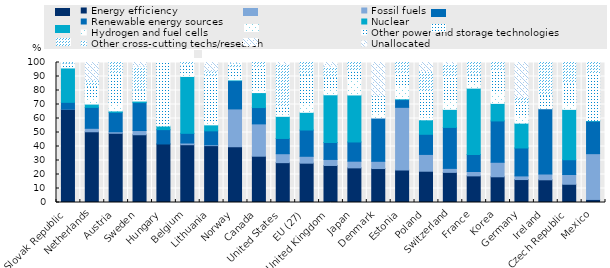
| Category | Energy efficiency | Fossil fuels | Renewable energy sources | Nuclear | Hydrogen and fuel cells | Other power and storage technologies | Other cross-cutting techs/research | Unallocated |
|---|---|---|---|---|---|---|---|---|
| Slovak Republic | 66.634 | 0.053 | 4.86 | 24.558 | 0.866 | 2.685 | 0.345 | 0 |
| Netherlands | 50.517 | 2.482 | 14.944 | 2.358 | 5.012 | 7.684 | 4.27 | 12.732 |
| Austria | 49.47 | 1.064 | 13.862 | 1.01 | 5.592 | 20.855 | 8.146 | 0 |
| Sweden | 48.397 | 3.009 | 19.972 | 1.081 | 1.253 | 6.748 | 16.939 | 2.602 |
| Hungary | 41.802 | 0 | 10.245 | 2.681 | 0.01 | 45.262 | 0 | 0 |
| Belgium | 41.271 | 1.22 | 6.928 | 40.624 | 1.68 | 6.502 | 1.775 | 0 |
| Lithuania | 40.62 | 0.621 | 9.936 | 4.292 | 1.966 | 33.342 | 3.205 | 6.017 |
| Norway | 39.822 | 27.025 | 20.188 | 0.531 | 2.017 | 7.668 | 2.544 | 0.204 |
| Canada | 33.068 | 23.09 | 11.657 | 10.685 | 3.483 | 14.917 | 3.1 | 0 |
| United States | 28.467 | 6.378 | 10.906 | 15.804 | 1.958 | 4.828 | 30.697 | 0.962 |
| EU (27) | 28.098 | 4.91 | 18.765 | 12.644 | 6.906 | 19.954 | 8.722 | 0 |
| United Kingdom | 26.451 | 4.313 | 12.099 | 34.082 | 4.117 | 8.414 | 7.786 | 2.738 |
| Japan | 24.742 | 4.757 | 13.729 | 33.589 | 10.385 | 6.99 | 5.807 | 0 |
| Denmark | 24.26 | 5.167 | 30.895 | 0 | 3.825 | 12.168 | 0.042 | 23.643 |
| Estonia | 23.167 | 44.805 | 5.503 | 0.597 | 9.494 | 8.935 | 7.499 | 0 |
| Poland | 22.342 | 11.999 | 14.383 | 10.333 | 2.206 | 18.759 | 13.562 | 6.417 |
| Switzerland | 21.52 | 2.844 | 29.268 | 12.897 | 6.592 | 16.997 | 9.205 | 0.676 |
| France | 19.017 | 3.145 | 12.138 | 47.379 | 4.2 | 5.315 | 8.807 | 0 |
| Korea | 18.362 | 10.376 | 29.524 | 12.525 | 8.7 | 15.444 | 5.068 | 0 |
| Germany | 16.389 | 2.601 | 19.949 | 17.74 | 4.949 | 9.394 | 4.04 | 24.937 |
| Ireland | 16.223 | 4.093 | 46.652 | 0 | 1.194 | 8.27 | 23.567 | 0 |
| Czech Republic | 13.028 | 6.985 | 10.519 | 35.976 | 4.437 | 14.387 | 14.668 | 0 |
| Mexico | 2.188 | 32.691 | 23.215 | 0.415 | 0.177 | 33.611 | 7.704 | 0 |